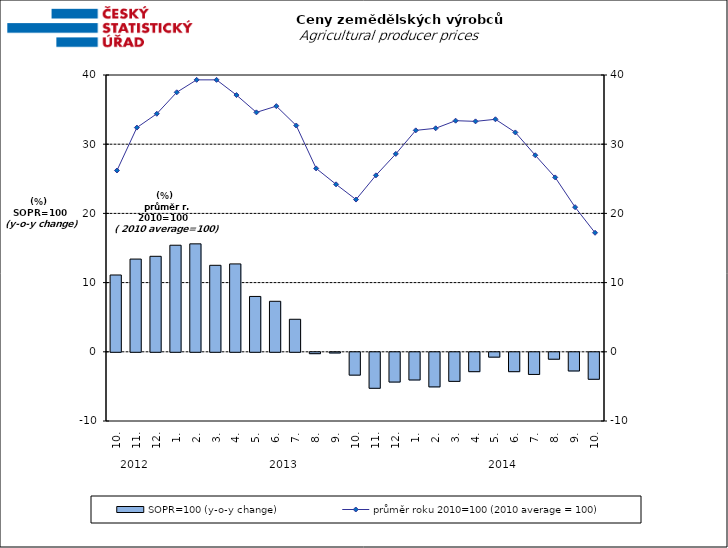
| Category | SOPR=100 (y-o-y change)   |
|---|---|
| 0 | 11.1 |
| 1 | 13.4 |
| 2 | 13.8 |
| 3 | 15.4 |
| 4 | 15.6 |
| 5 | 12.5 |
| 6 | 12.7 |
| 7 | 8 |
| 8 | 7.3 |
| 9 | 4.7 |
| 10 | -0.2 |
| 11 | -0.1 |
| 12 | -3.3 |
| 13 | -5.2 |
| 14 | -4.3 |
| 15 | -4 |
| 16 | -5 |
| 17 | -4.2 |
| 18 | -2.8 |
| 19 | -0.7 |
| 20 | -2.8 |
| 21 | -3.2 |
| 22 | -1 |
| 23 | -2.7 |
| 24 | -3.9 |